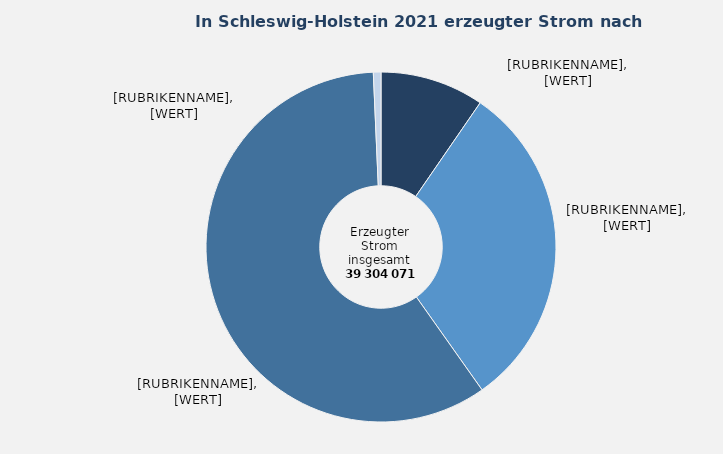
| Category | Anteil in Prozent |
|---|---|
| Fossile Energieträger | 9.591 |
| Kernenergie | 30.614 |
| Erneuerbare Energien | 59.096 |
| Abfälle und sonstige Energieträger | 0.699 |